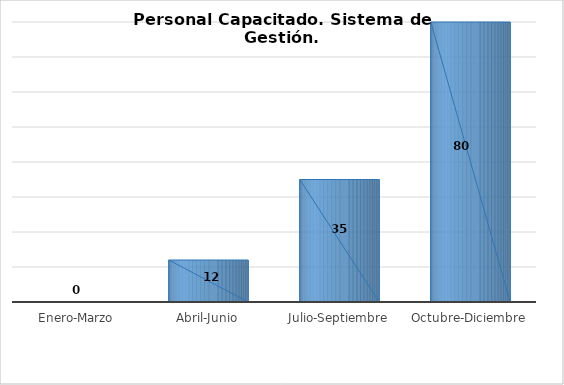
| Category | Personal Capacitado |
|---|---|
| Enero-Marzo | 0 |
| Abril-Junio | 12 |
| Julio-Septiembre | 35 |
| Octubre-Diciembre | 80 |